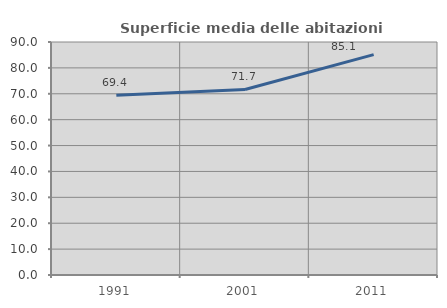
| Category | Superficie media delle abitazioni occupate |
|---|---|
| 1991.0 | 69.387 |
| 2001.0 | 71.672 |
| 2011.0 | 85.123 |